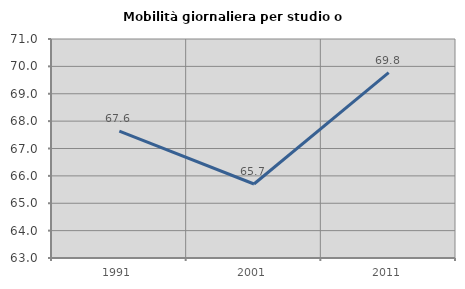
| Category | Mobilità giornaliera per studio o lavoro |
|---|---|
| 1991.0 | 67.636 |
| 2001.0 | 65.703 |
| 2011.0 | 69.773 |